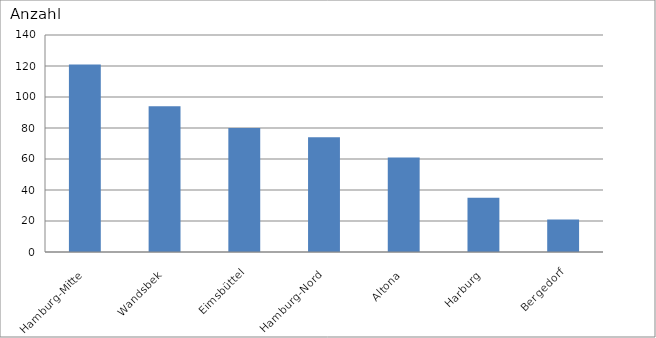
| Category | Hamburg-Mitte |
|---|---|
| Hamburg-Mitte | 121 |
| Wandsbek | 94 |
| Eimsbüttel | 80 |
| Hamburg-Nord | 74 |
| Altona | 61 |
| Harburg | 35 |
| Bergedorf | 21 |